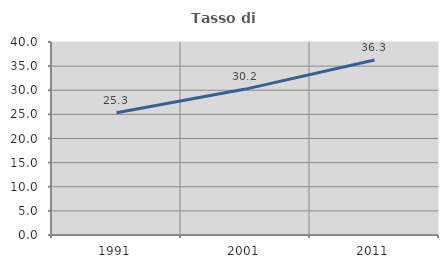
| Category | Tasso di occupazione   |
|---|---|
| 1991.0 | 25.318 |
| 2001.0 | 30.238 |
| 2011.0 | 36.263 |